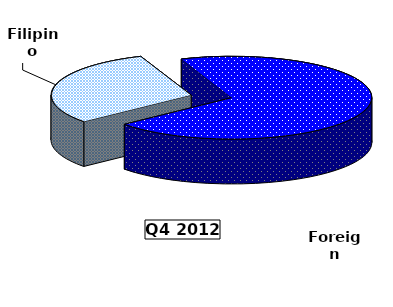
| Category | Series 0 |
|---|---|
| Filipino | 99.873 |
| Foreign | 230.215 |